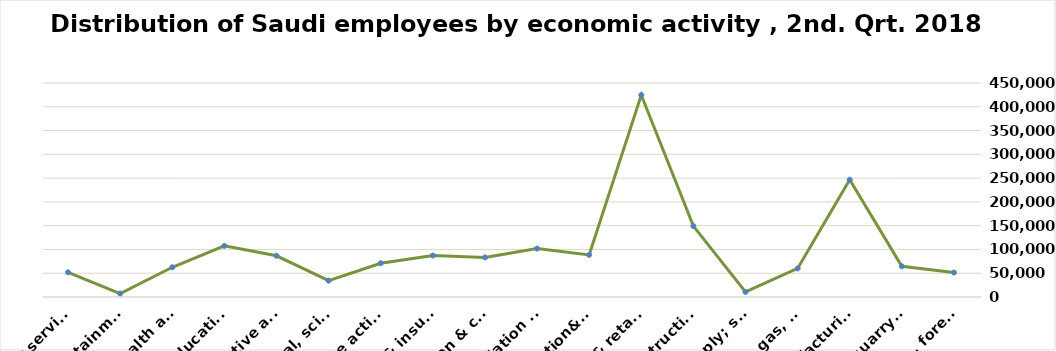
| Category | Series 0 |
|---|---|
| Agriculture, forestry & fishing | 51383 |
| Mining & quarrying | 64648 |
| Manufacturing | 246550 |
| Electricity, gas, steam & air conditioning supply | 60051 |
| Water supply; sewerage, waste remediation  | 10680 |
| Construction | 149107 |
| Wholesale& retail trade; repair of motor vehicles | 424653 |
| Transportation& storage | 88599 |
| Accommodation & food service activities | 101808 |
| Information & communication | 83304 |
| Financial & insurance | 87244 |
| Real estate activities | 71011 |
| Professional, scientific & technical activities | 34313 |
| Administrative and support service activities | 86675 |
| Education | 107457 |
| Human health and &l work activities | 62507 |
| Arts, entertainment & recreation | 7130 |
| Other service | 51897 |